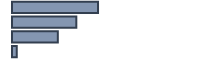
| Category | Series 0 |
|---|---|
| 0 | 42.8 |
| 1 | 32 |
| 2 | 22.8 |
| 3 | 2.4 |